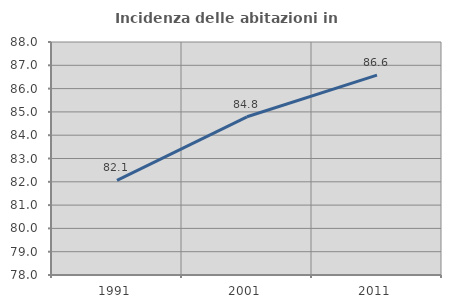
| Category | Incidenza delle abitazioni in proprietà  |
|---|---|
| 1991.0 | 82.06 |
| 2001.0 | 84.79 |
| 2011.0 | 86.577 |